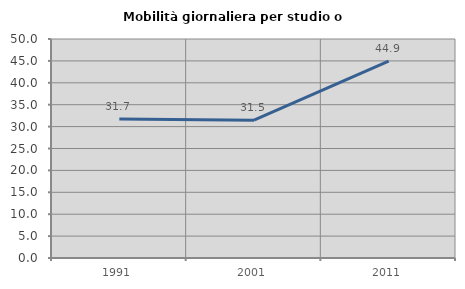
| Category | Mobilità giornaliera per studio o lavoro |
|---|---|
| 1991.0 | 31.732 |
| 2001.0 | 31.468 |
| 2011.0 | 44.944 |